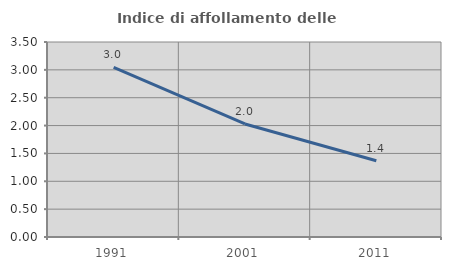
| Category | Indice di affollamento delle abitazioni  |
|---|---|
| 1991.0 | 3.045 |
| 2001.0 | 2.029 |
| 2011.0 | 1.369 |